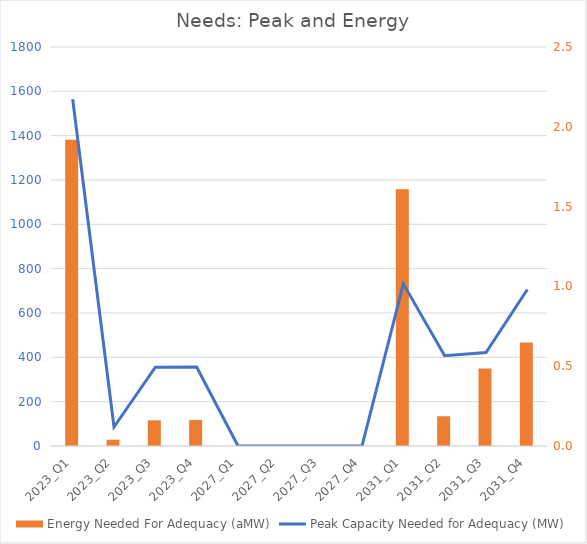
| Category | Energy Needed For Adequacy (aMW) |
|---|---|
| 2023_Q1 | 1.918 |
| 2023_Q2 | 0.039 |
| 2023_Q3 | 0.161 |
| 2023_Q4 | 0.163 |
| 2027_Q1 | 0 |
| 2027_Q2 | 0 |
| 2027_Q3 | 0 |
| 2027_Q4 | 0 |
| 2031_Q1 | 1.609 |
| 2031_Q2 | 0.187 |
| 2031_Q3 | 0.486 |
| 2031_Q4 | 0.648 |